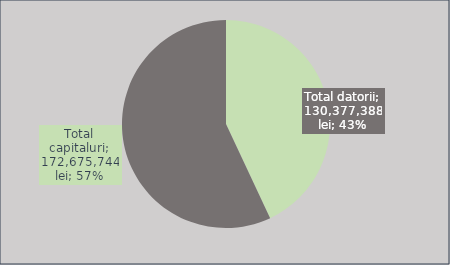
| Category | Series 0 |
|---|---|
| Total datorii | 130377387.572 |
| Total capitaluri | 172675743.601 |